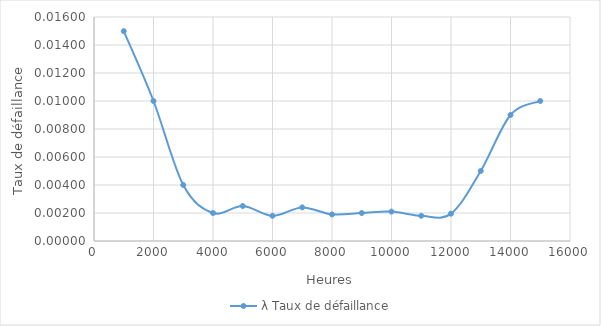
| Category | λ Taux de défaillance |
|---|---|
| 1000.0 | 0.015 |
| 2000.0 | 0.01 |
| 3000.0 | 0.004 |
| 4000.0 | 0.002 |
| 5000.0 | 0.002 |
| 6000.0 | 0.002 |
| 7000.0 | 0.002 |
| 8000.0 | 0.002 |
| 9000.0 | 0.002 |
| 10000.0 | 0.002 |
| 11000.0 | 0.002 |
| 12000.0 | 0.002 |
| 13000.0 | 0.005 |
| 14000.0 | 0.009 |
| 15000.0 | 0.01 |